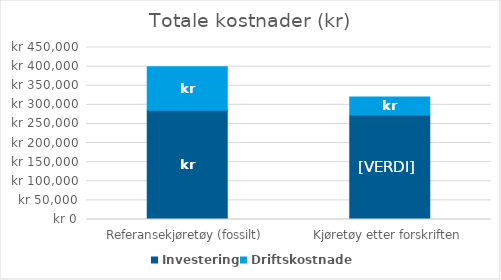
| Category | Investering | Driftskostnader |
|---|---|---|
| Referansekjøretøy (fossilt) | 285762 | 113612.732 |
| Kjøretøy etter forskriften | 273465 | 46763.7 |